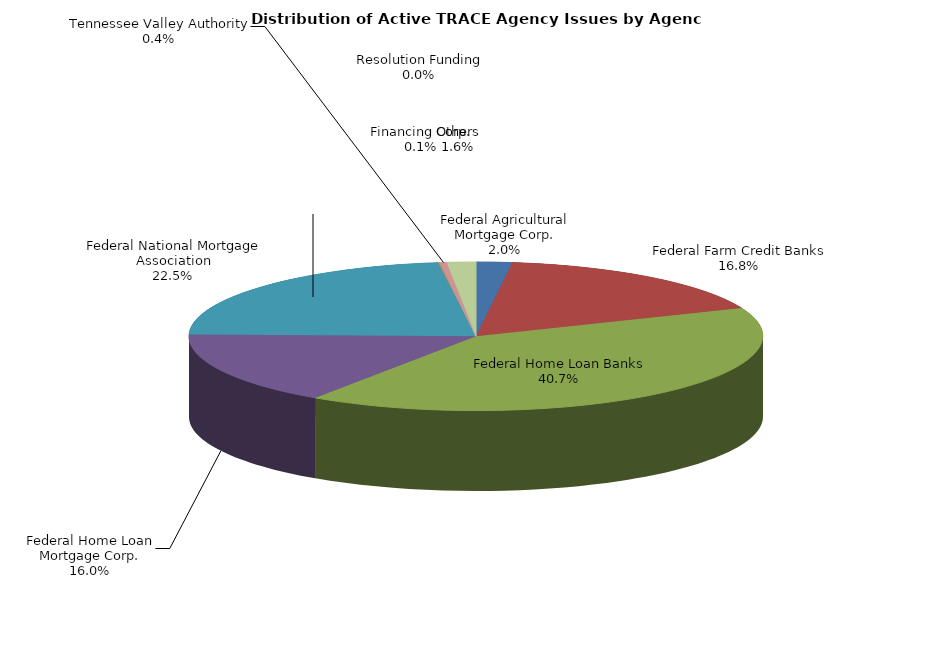
| Category | Series 0 |
|---|---|
| Federal Agricultural Mortgage Corp. | 327 |
| Federal Farm Credit Banks | 2714 |
| Federal Home Loan Banks | 6578 |
| Federal Home Loan Mortgage Corp. | 2582 |
| Federal National Mortgage Association | 3639 |
| Financing Corp. | 14 |
| Resolution Funding | 6 |
| Tennessee Valley Authority | 57 |
| Others | 264 |